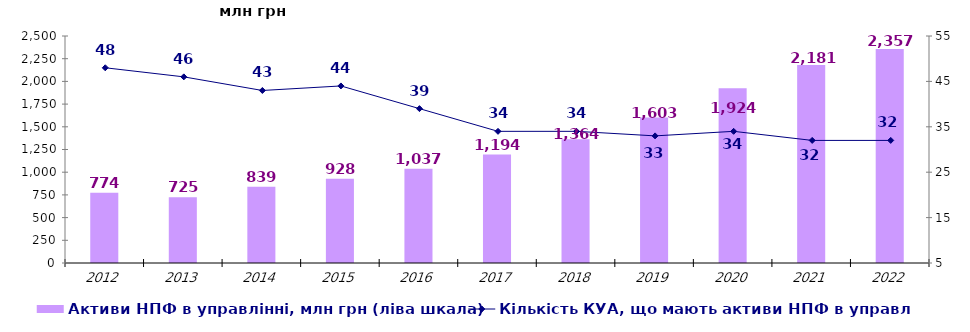
| Category | Активи НПФ в управлінні, млн грн (ліва шкала) |
|---|---|
| 2012.0 | 773.914 |
| 2013.0 | 725.444 |
| 2014.0 | 838.841 |
| 2015.0 | 928.153 |
| 2016.0 | 1036.645 |
| 2017.0 | 1193.979 |
| 2018.0 | 1364.137 |
| 2019.0 | 1603.152 |
| 2020.0 | 1924.169 |
| 2021.0 | 2181.473 |
| 2022.0 | 2356.598 |